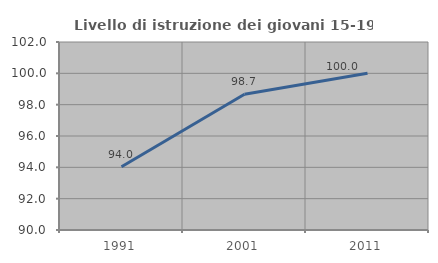
| Category | Livello di istruzione dei giovani 15-19 anni |
|---|---|
| 1991.0 | 94.037 |
| 2001.0 | 98.667 |
| 2011.0 | 100 |